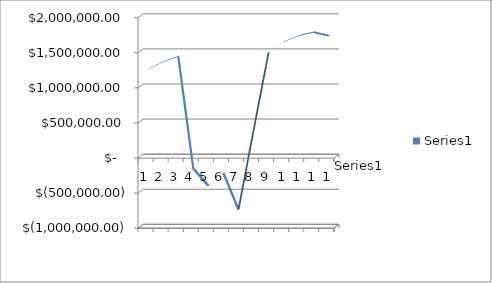
| Category | Series 0 |
|---|---|
| 0 | 1227158.98 |
| 1 | 1326977.09 |
| 2 | 1408086.91 |
| 3 | -192272.2 |
| 4 | -437772.29 |
| 5 | -256690.07 |
| 6 | -777693.46 |
| 7 | 348684.1 |
| 8 | 1465064.53 |
| 9 | 1614792.12 |
| 10 | 1703522.25 |
| 11 | 1751057.58 |
| 12 | 1700399.36 |